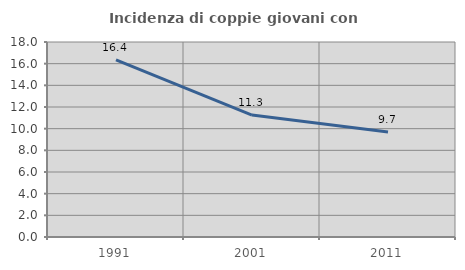
| Category | Incidenza di coppie giovani con figli |
|---|---|
| 1991.0 | 16.36 |
| 2001.0 | 11.252 |
| 2011.0 | 9.698 |